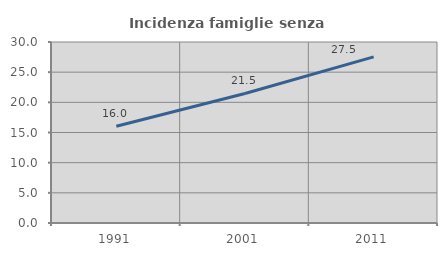
| Category | Incidenza famiglie senza nuclei |
|---|---|
| 1991.0 | 16.034 |
| 2001.0 | 21.472 |
| 2011.0 | 27.529 |